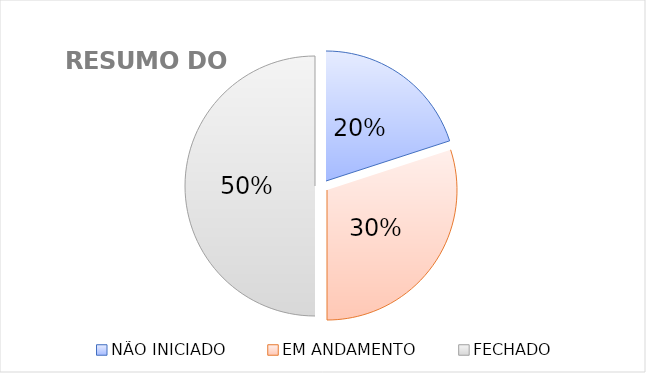
| Category | Series 0 |
|---|---|
| NÃO INICIADO | 2 |
| EM ANDAMENTO | 3 |
| FECHADO | 5 |